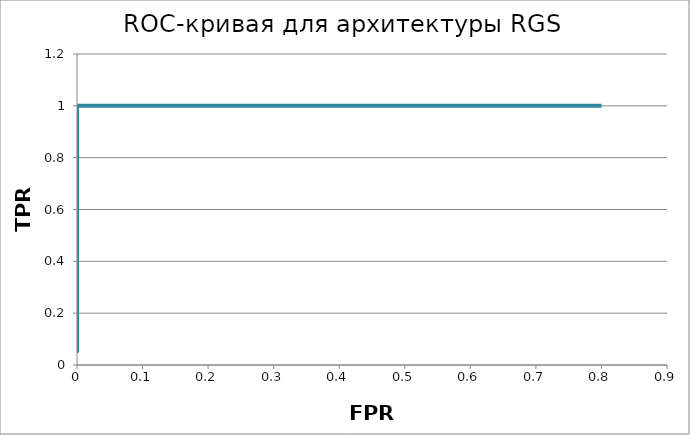
| Category | Series 0 |
|---|---|
| 0.0 | 0.048 |
| 0.0 | 0.095 |
| 0.0 | 0.143 |
| 0.0 | 0.19 |
| 0.0 | 0.238 |
| 0.0 | 0.286 |
| 0.0 | 0.333 |
| 0.0 | 0.381 |
| 0.0 | 0.429 |
| 0.0 | 0.476 |
| 0.0 | 0.524 |
| 0.0 | 0.571 |
| 0.0 | 0.619 |
| 0.0 | 0.667 |
| 0.0 | 0.714 |
| 0.0 | 0.762 |
| 0.0 | 0.81 |
| 0.0 | 0.857 |
| 0.0 | 0.905 |
| 0.0 | 0.952 |
| 0.0 | 1 |
| 0.0 | 1 |
| 0.050000000000000044 | 1 |
| 0.09999999999999998 | 1 |
| 0.15000000000000002 | 1 |
| 0.19999999999999996 | 1 |
| 0.25 | 1 |
| 0.30000000000000004 | 1 |
| 0.35 | 1 |
| 0.4 | 1 |
| 0.44999999999999996 | 1 |
| 0.5 | 1 |
| 0.55 | 1 |
| 0.6 | 1 |
| 0.65 | 1 |
| 0.7 | 1 |
| 0.75 | 1 |
| 0.8 | 1 |